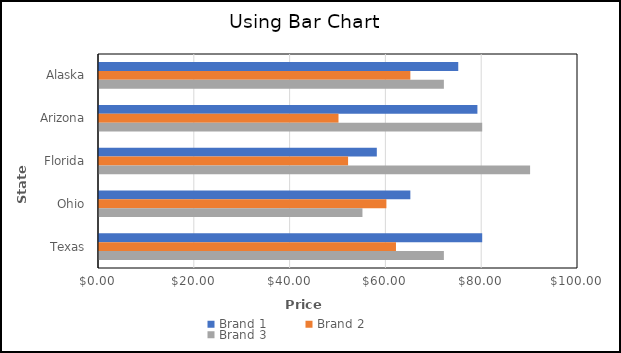
| Category | Brand 1 | Brand 2 | Brand 3 |
|---|---|---|---|
| Alaska | 75 | 65 | 72 |
| Arizona | 79 | 50 | 80 |
| Florida | 58 | 52 | 90 |
| Ohio | 65 | 60 | 55 |
| Texas | 80 | 62 | 72 |